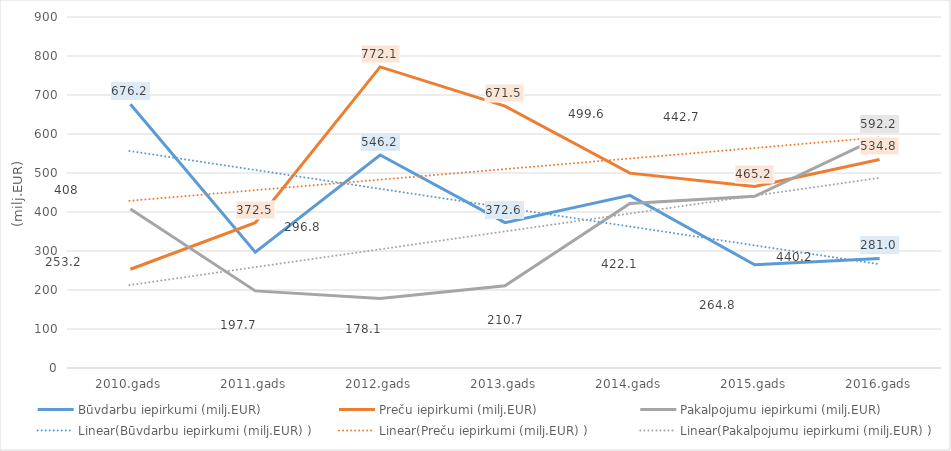
| Category | Būvdarbu iepirkumi (milj.EUR) | Preču iepirkumi (milj.EUR) | Pakalpojumu iepirkumi (milj.EUR) |
|---|---|---|---|
| 2010.gads | 676.2 | 253.2 | 408 |
| 2011.gads | 296.8 | 372.5 | 197.7 |
| 2012.gads | 546.2 | 772.1 | 178.1 |
| 2013.gads | 372.6 | 671.5 | 210.7 |
| 2014.gads | 442.7 | 499.6 | 422.1 |
| 2015.gads | 264.8 | 465.2 | 440.2 |
| 2016.gads | 281 | 534.8 | 592.2 |